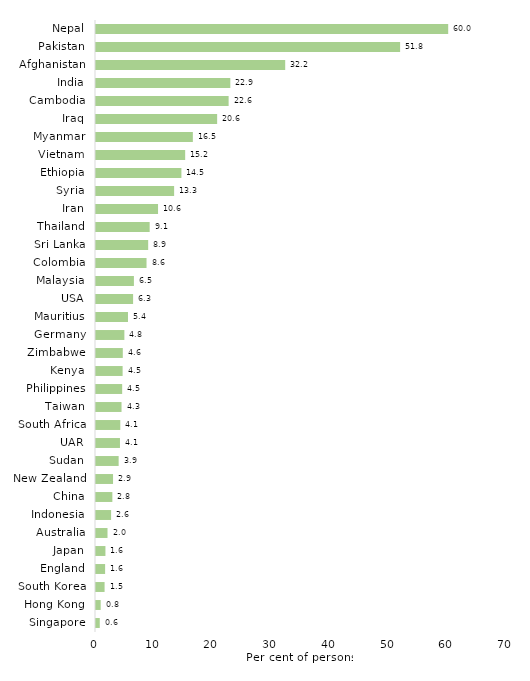
| Category | Series 0 |
|---|---|
| Singapore | 0.642 |
| Hong Kong | 0.798 |
| South Korea | 1.462 |
| England | 1.552 |
| Japan | 1.606 |
| Australia | 1.96 |
| Indonesia | 2.571 |
| China | 2.785 |
| New Zealand | 2.902 |
| Sudan | 3.857 |
| UAR | 4.082 |
| South Africa | 4.137 |
| Taiwan | 4.348 |
| Philippines | 4.458 |
| Kenya | 4.533 |
| Zimbabwe | 4.564 |
| Germany | 4.833 |
| Mauritius | 5.447 |
| USA | 6.317 |
| Malaysia | 6.457 |
| Colombia | 8.605 |
| Sri Lanka | 8.888 |
| Thailand | 9.141 |
| Iran | 10.566 |
| Syria | 13.306 |
| Ethiopia | 14.545 |
| Vietnam | 15.187 |
| Myanmar | 16.495 |
| Iraq | 20.633 |
| Cambodia | 22.588 |
| India | 22.876 |
| Afghanistan | 32.225 |
| Pakistan | 51.796 |
| Nepal | 59.985 |